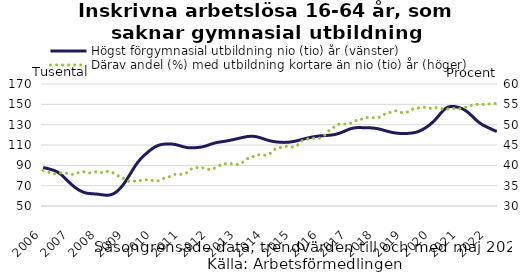
| Category | Högst förgymnasial utbildning nio (tio) år (vänster) |
|---|---|
| 2006 | 87.802 |
| 2006-02 | 87.373 |
| 2006-03 | 86.816 |
| 2006-04 | 86.18 |
| 2006-05 | 85.501 |
| 2006-06 | 84.723 |
| 2006-07 | 83.674 |
| 2006-08 | 82.23 |
| 2006-09 | 80.421 |
| 2006-10 | 78.326 |
| 2006-11 | 76.077 |
| 2006-12 | 73.823 |
| 2007 | 71.665 |
| 2007-02 | 69.674 |
| 2007-03 | 67.9 |
| 2007-04 | 66.349 |
| 2007-05 | 65.012 |
| 2007-06 | 63.919 |
| 2007-07 | 63.115 |
| 2007-08 | 62.586 |
| 2007-09 | 62.268 |
| 2007-10 | 62.072 |
| 2007-11 | 61.924 |
| 2007-12 | 61.752 |
| 2008 | 61.51 |
| 2008-02 | 61.203 |
| 2008-03 | 60.872 |
| 2008-04 | 60.631 |
| 2008-05 | 60.62 |
| 2008-06 | 60.946 |
| 2008-07 | 61.681 |
| 2008-08 | 62.883 |
| 2008-09 | 64.557 |
| 2008-10 | 66.697 |
| 2008-11 | 69.277 |
| 2008-12 | 72.261 |
| 2009 | 75.613 |
| 2009-02 | 79.248 |
| 2009-03 | 83.018 |
| 2009-04 | 86.732 |
| 2009-05 | 90.209 |
| 2009-06 | 93.324 |
| 2009-07 | 96.038 |
| 2009-08 | 98.405 |
| 2009-09 | 100.546 |
| 2009-10 | 102.546 |
| 2009-11 | 104.434 |
| 2009-12 | 106.184 |
| 2010 | 107.706 |
| 2010-02 | 108.924 |
| 2010-03 | 109.822 |
| 2010-04 | 110.424 |
| 2010-05 | 110.787 |
| 2010-06 | 110.977 |
| 2010-07 | 111.053 |
| 2010-08 | 111.016 |
| 2010-09 | 110.831 |
| 2010-10 | 110.478 |
| 2010-11 | 109.963 |
| 2010-12 | 109.32 |
| 2011 | 108.638 |
| 2011-02 | 108.016 |
| 2011-03 | 107.541 |
| 2011-04 | 107.271 |
| 2011-05 | 107.194 |
| 2011-06 | 107.253 |
| 2011-07 | 107.387 |
| 2011-08 | 107.581 |
| 2011-09 | 107.877 |
| 2011-10 | 108.315 |
| 2011-11 | 108.913 |
| 2011-12 | 109.646 |
| 2012 | 110.443 |
| 2012-02 | 111.215 |
| 2012-03 | 111.886 |
| 2012-04 | 112.412 |
| 2012-05 | 112.812 |
| 2012-06 | 113.155 |
| 2012-07 | 113.5 |
| 2012-08 | 113.884 |
| 2012-09 | 114.305 |
| 2012-10 | 114.755 |
| 2012-11 | 115.241 |
| 2012-12 | 115.753 |
| 2013 | 116.275 |
| 2013-02 | 116.799 |
| 2013-03 | 117.312 |
| 2013-04 | 117.794 |
| 2013-05 | 118.203 |
| 2013-06 | 118.473 |
| 2013-07 | 118.567 |
| 2013-08 | 118.473 |
| 2013-09 | 118.175 |
| 2013-10 | 117.679 |
| 2013-11 | 117.006 |
| 2013-12 | 116.227 |
| 2014 | 115.441 |
| 2014-02 | 114.722 |
| 2014-03 | 114.115 |
| 2014-04 | 113.634 |
| 2014-05 | 113.264 |
| 2014-06 | 112.984 |
| 2014-07 | 112.774 |
| 2014-08 | 112.627 |
| 2014-09 | 112.566 |
| 2014-10 | 112.608 |
| 2014-11 | 112.756 |
| 2014-12 | 113.017 |
| 2015 | 113.381 |
| 2015-02 | 113.839 |
| 2015-03 | 114.375 |
| 2015-04 | 114.961 |
| 2015-05 | 115.573 |
| 2015-06 | 116.176 |
| 2015-07 | 116.745 |
| 2015-08 | 117.263 |
| 2015-09 | 117.73 |
| 2015-10 | 118.143 |
| 2015-11 | 118.5 |
| 2015-12 | 118.79 |
| 2016 | 119.01 |
| 2016-02 | 119.18 |
| 2016-03 | 119.324 |
| 2016-04 | 119.472 |
| 2016-05 | 119.656 |
| 2016-06 | 119.925 |
| 2016-07 | 120.325 |
| 2016-08 | 120.879 |
| 2016-09 | 121.59 |
| 2016-10 | 122.443 |
| 2016-11 | 123.398 |
| 2016-12 | 124.383 |
| 2017 | 125.308 |
| feb-17 | 126.087 |
| mar-17 | 126.657 |
| apr-17 | 126.996 |
| maj-17 | 127.133 |
| jun-17 | 127.132 |
| jul-17 | 127.067 |
| aug-17 | 127.007 |
| sep-17 | 126.965 |
| okt-17 | 126.904 |
| nov-17 | 126.78 |
| dec-17 | 126.565 |
| 2018 | 126.245 |
| feb-18 | 125.804 |
| mar-18 | 125.236 |
| apr-18 | 124.585 |
| maj-18 | 123.926 |
| jun-18 | 123.31 |
| jul-18 | 122.753 |
| aug-18 | 122.27 |
| sep-18 | 121.875 |
| okt-18 | 121.588 |
| nov-18 | 121.407 |
| dec-18 | 121.3 |
| 2019 | 121.27 |
| feb-19 | 121.335 |
| mar-19 | 121.492 |
| apr-19 | 121.718 |
| maj-19 | 122.018 |
| jun-19 | 122.463 |
| jul-19 | 123.162 |
| aug-19 | 124.129 |
| sep-19 | 125.315 |
| okt-19 | 126.672 |
| nov-19 | 128.174 |
| dec-19 | 129.85 |
| 2020 | 131.762 |
| feb-20 | 133.943 |
| mar-20 | 136.425 |
| apr-20 | 139.128 |
| maj-20 | 141.828 |
| jun-20 | 144.248 |
| jul-20 | 146.117 |
| aug-20 | 147.312 |
| sep-20 | 147.888 |
| okt-20 | 147.968 |
| nov-20 | 147.71 |
| dec-20 | 147.247 |
| 2021 | 146.6 |
| feb-21 | 145.732 |
| mar-21 | 144.557 |
| apr-21 | 143.021 |
| maj-21 | 141.166 |
| jun-21 | 139.063 |
| jul-21 | 136.854 |
| aug-21 | 134.717 |
| sep-21 | 132.765 |
| okt-21 | 131.076 |
| nov-21 | 129.667 |
| dec-21 | 128.475 |
| 2022 | 127.38 |
| feb-22 | 126.287 |
| mar-22 | 125.193 |
| apr-22 | 124.179 |
| maj-22 | 123.333 |